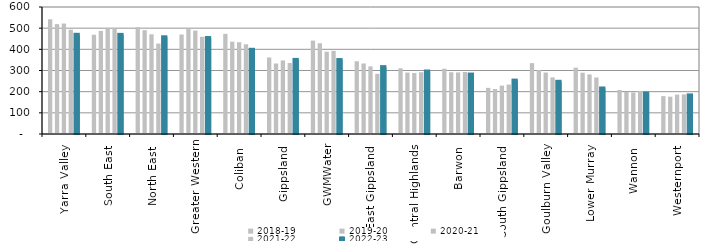
| Category | 2018-19 | 2019-20 | 2020-21 | 2021-22 | 2022-23 |
|---|---|---|---|---|---|
| Yarra Valley  | 541.881 | 519.241 | 521.886 | 492.914 | 468.679 |
| South East  | 469.035 | 486.81 | 496.681 | 499.16 | 468.33 |
| North East  | 504.579 | 490.631 | 471.016 | 427.133 | 456.887 |
| Greater Western | 470.184 | 495.704 | 488.497 | 459.359 | 453.377 |
| Coliban  | 473.053 | 436.124 | 433.685 | 423.818 | 397.798 |
| Gippsland  | 361.553 | 333.075 | 347.588 | 335.179 | 350.097 |
| GWMWater | 441.313 | 428.725 | 388.804 | 392.807 | 349.453 |
| East Gippsland  | 343.732 | 333.188 | 319.287 | 284.161 | 315.909 |
| Central Highlands  | 310.601 | 290.221 | 287.935 | 291.783 | 295.203 |
| Barwon  | 308.508 | 291.695 | 291 | 292.963 | 280.837 |
| South Gippsland  | 217.925 | 212.578 | 228.537 | 233.462 | 252.222 |
| Goulburn Valley  | 334.889 | 302.09 | 290.323 | 267.339 | 246.596 |
| Lower Murray  | 313.392 | 289.567 | 281.56 | 266.984 | 215.077 |
| Wannon  | 208.09 | 198.738 | 196.084 | 203.403 | 191.06 |
| Westernport  | 178.976 | 176.249 | 186.084 | 187.239 | 182.369 |